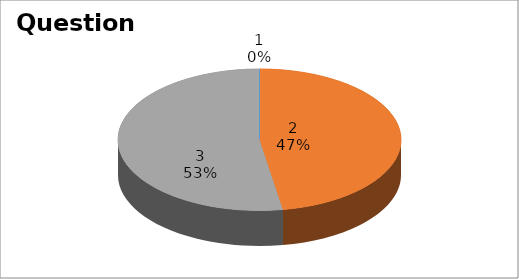
| Category | Series 0 |
|---|---|
| 0 | 0 |
| 1 | 9 |
| 2 | 10 |